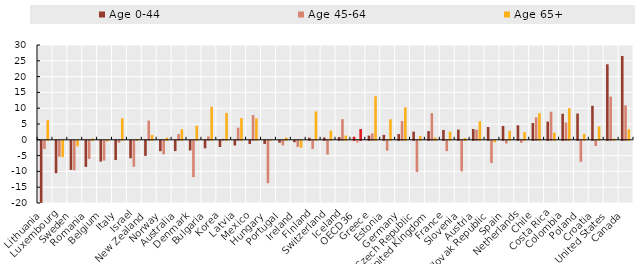
| Category | Age 0-44 | Age 45-64 | Age 65+ |
|---|---|---|---|
| Lithuania | -19.673 | -2.585 | 6.177 |
| Luxembourg | -10.259 | -5.016 | -5.159 |
| Sweden | -9.206 | -9.336 | -1.75 |
| Romania | -8.251 | -5.763 | 0.384 |
| Belgium | -6.567 | -6.254 | -0.222 |
| Italy | -6.09 | -0.644 | 6.819 |
| Israel | -5.535 | -8.22 | 0.231 |
| New Zealand | -4.777 | 6.071 | 1.522 |
| Norway | -3.298 | -4.273 | 0.666 |
| Australia | -3.244 | 1.821 | 3.335 |
| Denmark | -3.059 | -11.513 | 4.46 |
| Bulgaria | -2.359 | 1.055 | 10.435 |
| Korea | -1.966 | 0.313 | 8.489 |
| Latvia | -1.481 | 3.854 | 6.887 |
| Mexico | -1.029 | 7.859 | 6.772 |
| Hungary | -0.996 | -13.434 | 0.037 |
| Portugal | -0.619 | -1.45 | 0.696 |
| Ireland | -0.455 | -1.937 | -2.211 |
| Finland | 0.672 | -2.558 | 8.994 |
| Switzerland | 0.745 | -4.371 | 2.885 |
| Iceland | 0.889 | 6.542 | 1.332 |
| OECD36 | 0.97 | -0.57 | 3.401 |
| Greece | 1.319 | 2.039 | 13.782 |
| Estonia | 1.557 | -3.117 | 6.48 |
| Germany | 1.824 | 5.959 | 10.275 |
| Czech Republic | 2.579 | -9.878 | 1.182 |
| United Kingdom | 2.747 | 8.44 | 0.768 |
| France | 3.117 | -3.26 | 2.562 |
| Slovenia | 3.227 | -9.675 | 0.555 |
| Austria | 3.428 | 3.203 | 5.866 |
| Slovak Republic | 4.048 | -7.031 | -0.505 |
| Spain | 4.383 | -0.855 | 2.859 |
| Netherlands | 4.594 | -0.64 | 2.451 |
| Chile | 5.302 | 7.122 | 8.437 |
| Costa Rica | 5.76 | 8.891 | 2.235 |
| Colombia | 8.243 | 5.478 | 9.984 |
| Poland | 8.32 | -6.647 | 1.863 |
| Croatia | 10.762 | -1.65 | 4.204 |
| United States | 23.887 | 13.665 | 0.35 |
| Canada | 26.532 | 10.919 | 3.335 |